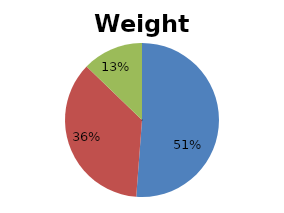
| Category | Pesos |
|---|---|
| C1 | 0.512 |
| C2 | 0.36 |
| C3 | 0.128 |